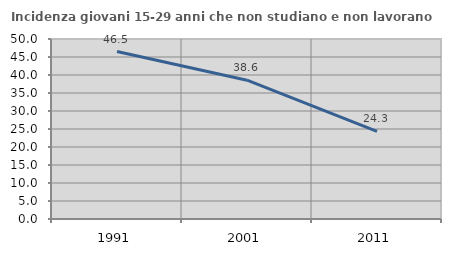
| Category | Incidenza giovani 15-29 anni che non studiano e non lavorano  |
|---|---|
| 1991.0 | 46.512 |
| 2001.0 | 38.554 |
| 2011.0 | 24.348 |